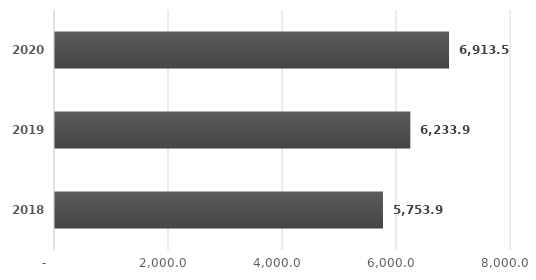
| Category | Series 0 |
|---|---|
| 2018.0 | 5753.9 |
| 2019.0 | 6233.9 |
| 2020.0 | 6913.5 |